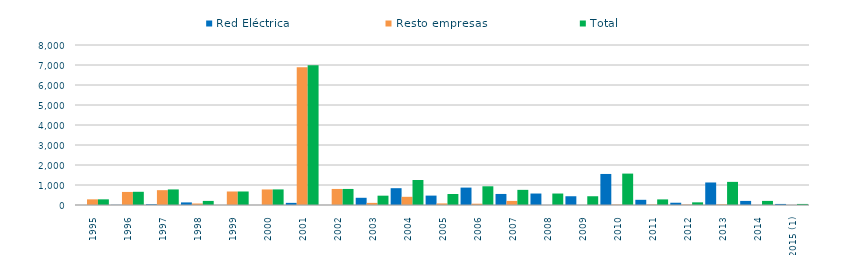
| Category | Red Eléctrica | Resto empresas | Total |
|---|---|---|---|
| 1995 | 0.54 | 282.36 | 282.9 |
| 1996 | 7.23 | 653.17 | 660.4 |
| 1997 | 36.95 | 741.45 | 778.4 |
| 1998 | 129.6 | 74.9 | 204.5 |
| 1999 | 0.46 | 675.17 | 675.63 |
| 2000 | 1.4 | 777.91 | 779.31 |
| 2001 | 107.04 | 6883.28 | 6990.32 |
| 2002 | 0.1 | 802.59 | 802.69 |
| 2003 | 360.4 | 105.83 | 466.23 |
| 2004 | 840.46 | 409.19 | 1249.65 |
| 2005 | 469.56 | 79.23 | 548.79 |
| 2006 | 870.41 | 65.39 | 935.8 |
| 2007 | 552.37 | 204.778 | 757.16 |
| 2008 | 573.542 | 0 | 573.542 |
| 2009 | 437.499 | 0 | 437.499 |
| 2010 | 1552.05 | 18.49 | 1570.54 |
| 2011 | 259.46 | 20.23 | 279.69 |
| 2012 | 113.47 | 19.29 | 132.77 |
| 2013 | 1126 | 30.18 | 1156.18 |
| 2014 | 204.346 | 0 | 204.346 |
| 2015 (1) | 52.77 | 0 | 52.77 |